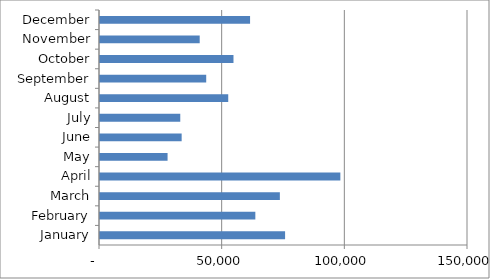
| Category | Series 0 |
|---|---|
| 2011-01-01 | 75443.61 |
| 2011-02-01 | 63319.34 |
| 2011-03-01 | 73313.54 |
| 2011-04-01 | 97971.86 |
| 2011-05-01 | 27542.86 |
| 2011-06-01 | 33283.73 |
| 2011-07-01 | 32717.02 |
| 2011-08-01 | 52268.37 |
| 2011-09-01 | 43292.22 |
| 2011-10-01 | 54408.28 |
| 2011-11-01 | 40640.05 |
| 2011-12-01 | 61169.73 |